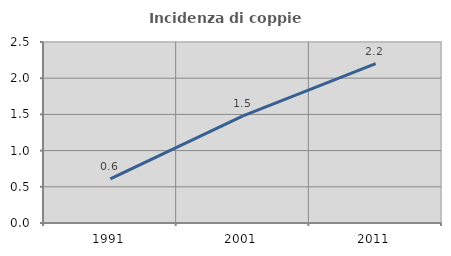
| Category | Incidenza di coppie miste |
|---|---|
| 1991.0 | 0.61 |
| 2001.0 | 1.481 |
| 2011.0 | 2.202 |